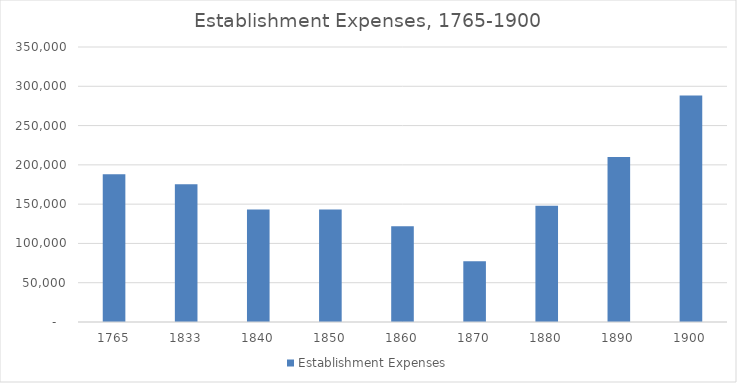
| Category | Establishment Expenses |
|---|---|
| 1765.0 | 188131 |
| 1833.0 | 175237.5 |
| 1840.0 | 143107 |
| 1850.0 | 143133 |
| 1860.0 | 121995 |
| 1870.0 | 77204 |
| 1880.0 | 148023 |
| 1890.0 | 209996 |
| 1900.0 | 288289 |